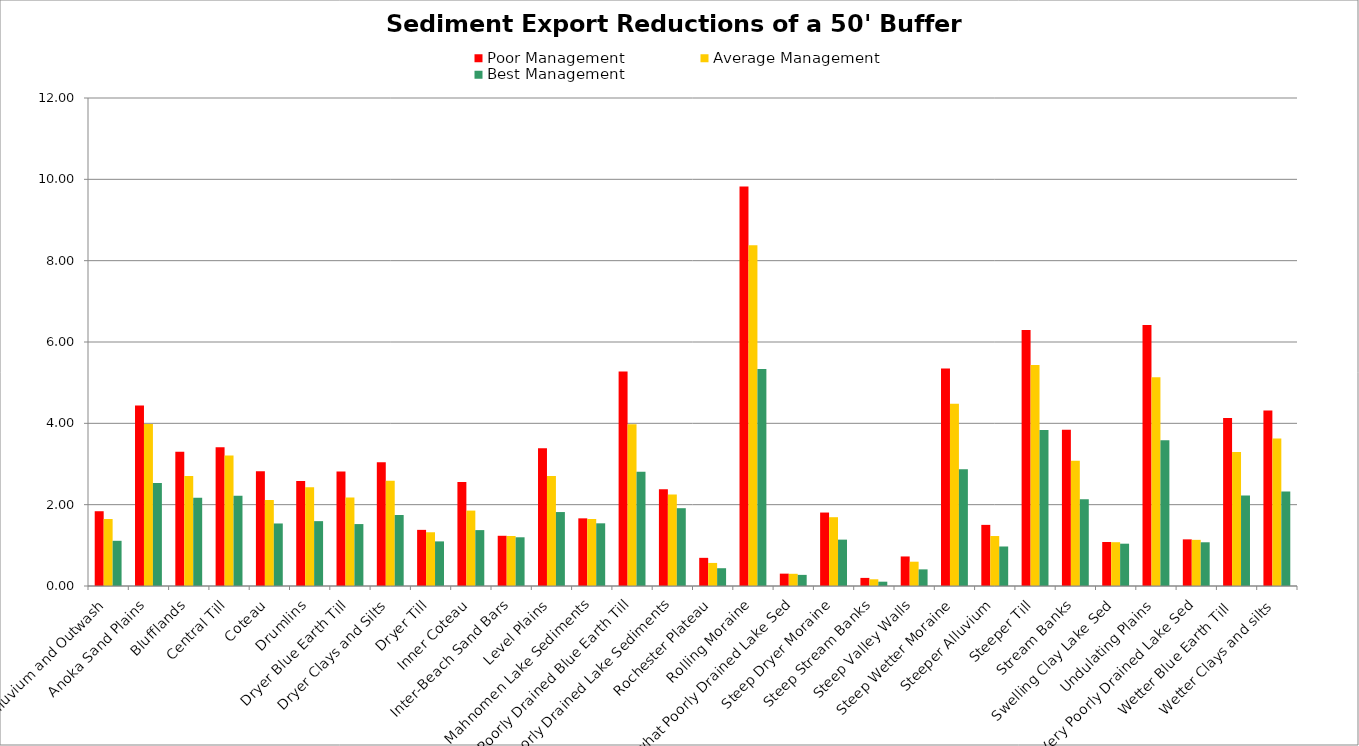
| Category | Poor Management | Average Management | Best Management |
|---|---|---|---|
| Alluvium and Outwash | 1.839 | 1.647 | 1.111 |
| Anoka Sand Plains | 4.441 | 3.982 | 2.531 |
| Blufflands | 3.303 | 2.703 | 2.169 |
| Central Till | 3.409 | 3.208 | 2.219 |
| Coteau | 2.824 | 2.116 | 1.538 |
| Drumlins | 2.581 | 2.43 | 1.595 |
| Dryer Blue Earth Till | 2.814 | 2.176 | 1.523 |
| Dryer Clays and Silts | 3.04 | 2.589 | 1.745 |
| Dryer Till | 1.38 | 1.321 | 1.097 |
| Inner Coteau | 2.559 | 1.854 | 1.374 |
| Inter-Beach Sand Bars | 1.235 | 1.23 | 1.198 |
| Level Plains | 3.389 | 2.708 | 1.818 |
| Mahnomen Lake Sediments | 1.664 | 1.647 | 1.541 |
| Poorly Drained Blue Earth Till | 5.277 | 3.976 | 2.808 |
| Poorly Drained Lake Sediments | 2.379 | 2.249 | 1.913 |
| Rochester Plateau | 0.693 | 0.567 | 0.437 |
| Rolling Moraine | 9.824 | 8.377 | 5.334 |
| Somewhat Poorly Drained Lake Sed | 0.304 | 0.3 | 0.274 |
| Steep Dryer Moraine | 1.806 | 1.692 | 1.14 |
| Steep Stream Banks | 0.199 | 0.165 | 0.106 |
| Steep Valley Walls | 0.726 | 0.598 | 0.409 |
| Steep Wetter Moraine | 5.346 | 4.479 | 2.871 |
| Steeper Alluvium | 1.503 | 1.229 | 0.972 |
| Steeper Till | 6.294 | 5.434 | 3.833 |
| Stream Banks | 3.84 | 3.078 | 2.133 |
| Swelling Clay Lake Sed | 1.082 | 1.077 | 1.04 |
| Undulating Plains | 6.418 | 5.132 | 3.586 |
| Very Poorly Drained Lake Sed | 1.147 | 1.135 | 1.075 |
| Wetter Blue Earth Till  | 4.131 | 3.297 | 2.227 |
| Wetter Clays and silts | 4.314 | 3.627 | 2.324 |